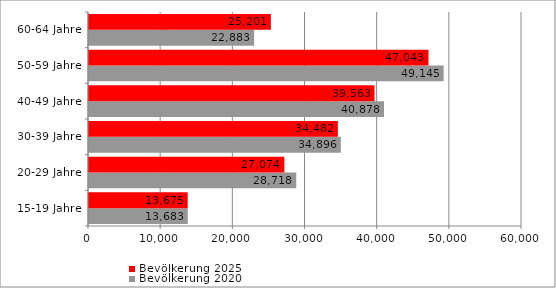
| Category | Bevölkerung 2020 | Bevölkerung 2025 |
|---|---|---|
| 15-19 Jahre | 13683 | 13675 |
| 20-29 Jahre | 28718 | 27074 |
| 30-39 Jahre | 34896 | 34482 |
| 40-49 Jahre | 40878 | 39563 |
| 50-59 Jahre | 49145 | 47043 |
| 60-64 Jahre | 22883 | 25201 |